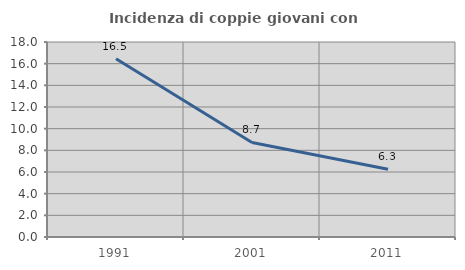
| Category | Incidenza di coppie giovani con figli |
|---|---|
| 1991.0 | 16.461 |
| 2001.0 | 8.73 |
| 2011.0 | 6.25 |